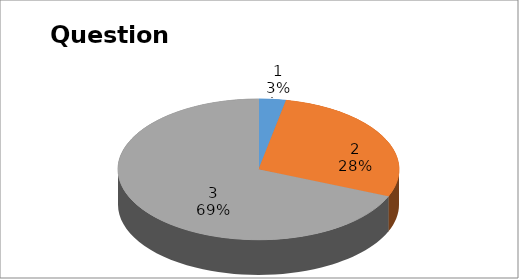
| Category | Series 0 |
|---|---|
| 0 | 1 |
| 1 | 9 |
| 2 | 22 |